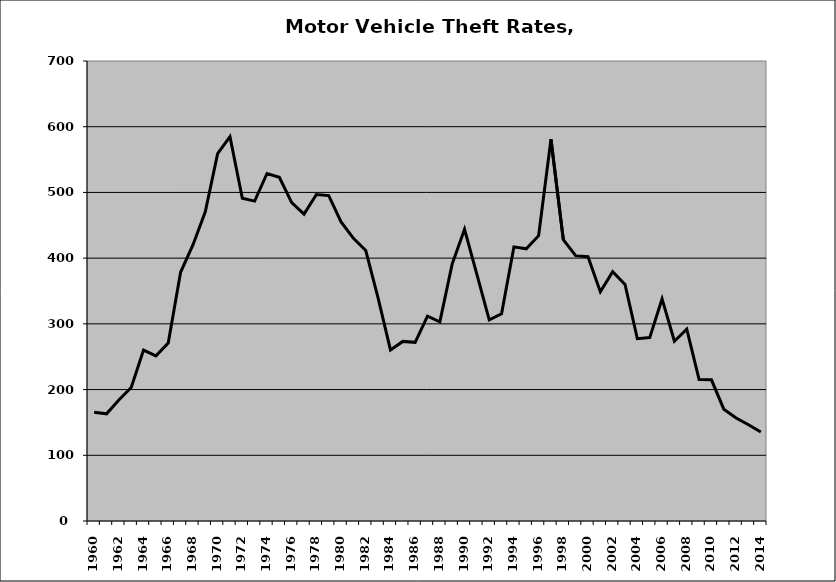
| Category | Motor Vehicle |
|---|---|
| 1960.0 | 165.587 |
| 1961.0 | 163.1 |
| 1962.0 | 184.222 |
| 1963.0 | 203.151 |
| 1964.0 | 260.081 |
| 1965.0 | 251.287 |
| 1966.0 | 270.703 |
| 1967.0 | 378.435 |
| 1968.0 | 420.037 |
| 1969.0 | 470.556 |
| 1970.0 | 559.018 |
| 1971.0 | 584.767 |
| 1972.0 | 491.15 |
| 1973.0 | 486.806 |
| 1974.0 | 528.796 |
| 1975.0 | 522.971 |
| 1976.0 | 484.364 |
| 1977.0 | 467.01 |
| 1978.0 | 496.913 |
| 1979.0 | 495.189 |
| 1980.0 | 455.127 |
| 1981.0 | 430.1 |
| 1982.0 | 411.628 |
| 1983.0 | 339.274 |
| 1984.0 | 260.359 |
| 1985.0 | 273.312 |
| 1986.0 | 271.88 |
| 1987.0 | 311.646 |
| 1988.0 | 303.182 |
| 1989.0 | 391.085 |
| 1990.0 | 443.882 |
| 1991.0 | 375.147 |
| 1992.0 | 306.096 |
| 1993.0 | 315.286 |
| 1994.0 | 417.139 |
| 1995.0 | 414.226 |
| 1996.0 | 434.207 |
| 1997.0 | 581.011 |
| 1998.0 | 428.226 |
| 1999.0 | 403.828 |
| 2000.0 | 402.118 |
| 2001.0 | 348.858 |
| 2002.0 | 379.306 |
| 2003.0 | 359.829 |
| 2004.0 | 277.326 |
| 2005.0 | 279.064 |
| 2006.0 | 337.912 |
| 2007.0 | 273.601 |
| 2008.0 | 291.825 |
| 2009.0 | 215.338 |
| 2010.0 | 214.826 |
| 2011.0 | 170.129 |
| 2012.0 | 156.807 |
| 2013.0 | 146.448 |
| 2014.0 | 135.419 |